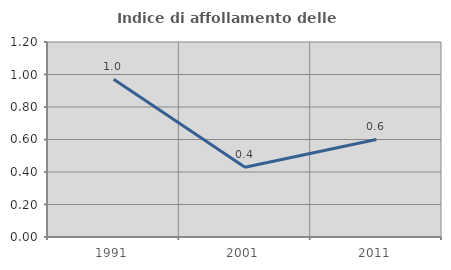
| Category | Indice di affollamento delle abitazioni  |
|---|---|
| 1991.0 | 0.971 |
| 2001.0 | 0.429 |
| 2011.0 | 0.6 |